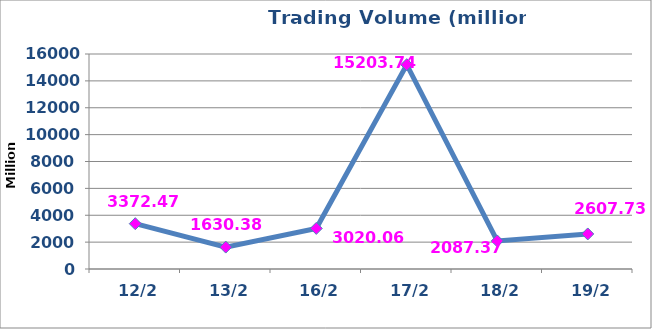
| Category | القيمة المتداولة |
|---|---|
|  12/2 | 3372473222 |
|  13/2 | 1630385662 |
|  16/2 | 3020067302 |
|  17/2 | 15203741554 |
|  18/2 | 2087376416 |
|  19/2 | 2607730130 |